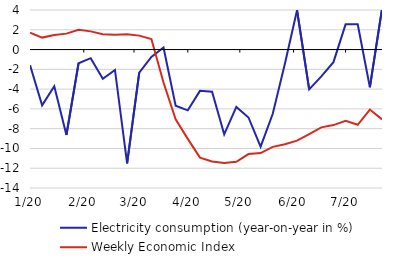
| Category | Electricity consumption (year-on-year in %) | Weekly Economic Index |
|---|---|---|
| 2020-01-06 | -1.577 | 1.7 |
| 2020-01-13 | -5.647 | 1.21 |
| 2020-01-20 | -3.719 | 1.48 |
| 2020-01-27 | -8.641 | 1.61 |
| 2020-02-03 | -1.389 | 2 |
| 2020-02-10 | -0.87 | 1.84 |
| 2020-02-17 | -2.961 | 1.55 |
| 2020-02-24 | -2.065 | 1.5 |
| 2020-03-02 | -11.504 | 1.54 |
| 2020-03-09 | -2.327 | 1.41 |
| 2020-03-16 | -0.745 | 1.06 |
| 2020-03-23 | 0.211 | -3.33 |
| 2020-03-30 | -5.681 | -7.06 |
| 2020-04-06 | -6.145 | -9.03 |
| 2020-04-13 | -4.176 | -10.93 |
| 2020-04-20 | -4.258 | -11.32 |
| 2020-04-27 | -8.574 | -11.48 |
| 2020-05-04 | -5.804 | -11.35 |
| 2020-05-11 | -6.869 | -10.57 |
| 2020-05-18 | -9.822 | -10.47 |
| 2020-05-25 | -6.497 | -9.84 |
| 2020-06-01 | -1.432 | -9.58 |
| 2020-06-08 | 3.975 | -9.21 |
| 2020-06-15 | -4.029 | -8.55 |
| 2020-06-22 | -2.715 | -7.87 |
| 2020-06-29 | -1.276 | -7.64 |
| 2020-07-06 | 2.548 | -7.21 |
| 2020-07-13 | 2.548 | -7.61 |
| 2020-07-20 | -3.81 | -6.07 |
| 2020-07-27 | 4.091 | -7.06 |